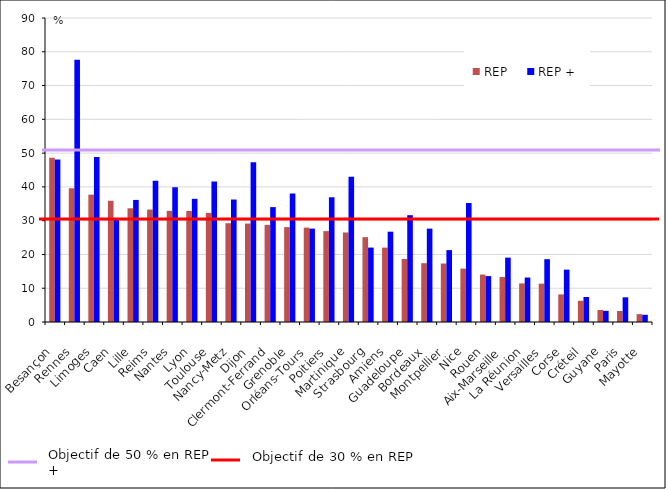
| Category | REP | REP + |
|---|---|---|
| Besançon | 48.624 | 48.119 |
| Rennes | 39.569 | 77.628 |
| Limoges | 37.704 | 48.833 |
| Caen | 35.894 | 30.222 |
| Lille | 33.659 | 36.142 |
| Reims | 33.288 | 41.812 |
| Nantes | 32.91 | 39.927 |
| Lyon | 32.873 | 36.465 |
| Toulouse | 32.3 | 41.61 |
| Nancy-Metz | 29.249 | 36.258 |
| Dijon | 29.147 | 47.273 |
| Clermont-Ferrand | 28.756 | 34.015 |
| Grenoble | 28.088 | 38.022 |
| Orléans-Tours | 27.947 | 27.646 |
| Poitiers | 26.904 | 36.932 |
| Martinique | 26.508 | 43.021 |
| Strasbourg | 25.121 | 22.03 |
| Amiens | 22.02 | 26.738 |
| Guadeloupe | 18.649 | 31.62 |
| Bordeaux | 17.408 | 27.647 |
| Montpellier | 17.309 | 21.29 |
| Nice | 15.808 | 35.222 |
| Rouen | 14.045 | 13.589 |
| Aix-Marseille | 13.309 | 19.051 |
| La Réunion | 11.437 | 13.17 |
| Versailles | 11.354 | 18.598 |
| Corse | 8.175 | 15.5 |
| Créteil | 6.282 | 7.408 |
| Guyane | 3.545 | 3.314 |
| Paris | 3.26 | 7.305 |
| Mayotte | 2.321 | 2.137 |